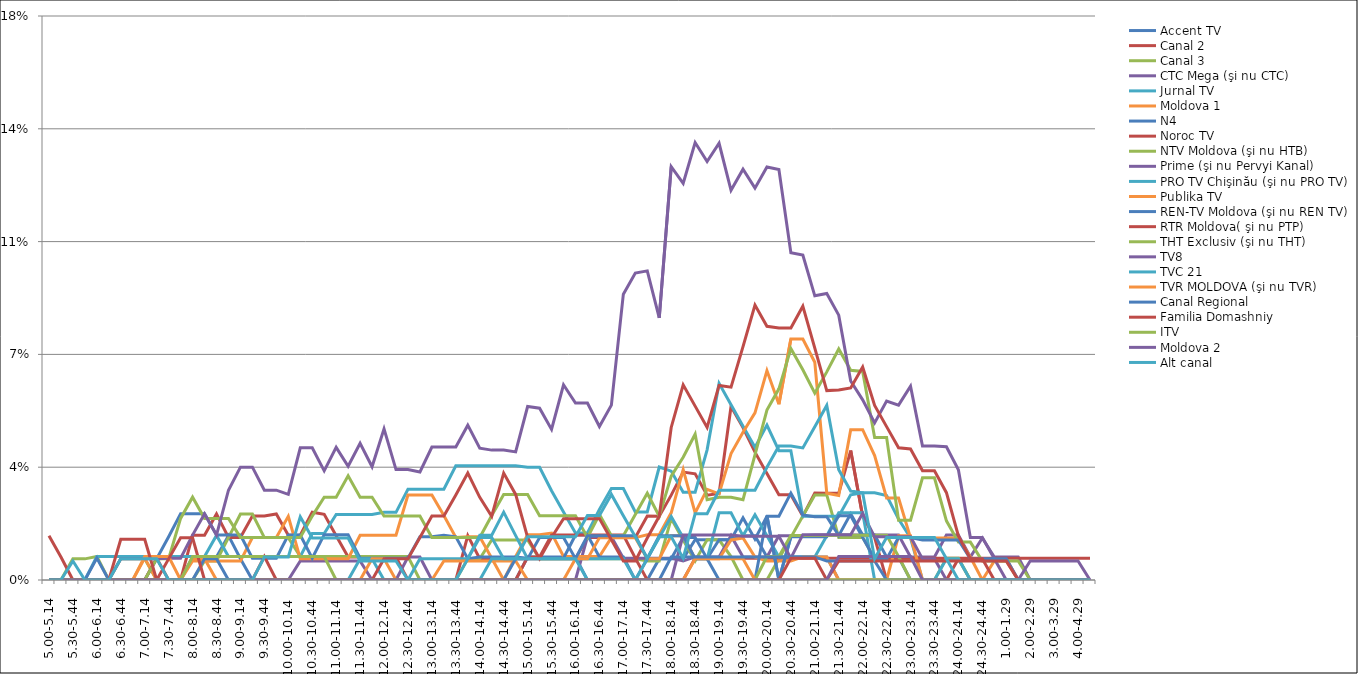
| Category | Accent TV | Canal 2 | Canal 3 | CTC Mega (şi nu CTC) | Jurnal TV | Moldova 1 | N4 | Noroc TV | NTV Moldova (şi nu HTB) | Prime (şi nu Pervyi Kanal) | PRO TV Chişinău (şi nu PRO TV) | Publika TV  | REN-TV Moldova (şi nu REN TV)  | RTR Moldova( şi nu PTP)  | THT Exclusiv (şi nu THT) | TV8 | TVC 21 | TVR MOLDOVA (şi nu TVR) | Canal Regional | Familia Domashniy | ITV | Moldova 2 | Alt canal |
|---|---|---|---|---|---|---|---|---|---|---|---|---|---|---|---|---|---|---|---|---|---|---|---|
| 5.00-5.14 | 0 | 0 | 0 | 0 | 0 | 0 | 0 | 0 | 0 | 0 | 0 | 0 | 0 | 0.014 | 0 | 0 | 0 | 0 | 0 | 0 | 0 | 0 | 0 |
| 5.15-5.29 | 0 | 0 | 0 | 0 | 0 | 0 | 0 | 0 | 0 | 0 | 0 | 0 | 0 | 0.007 | 0 | 0 | 0 | 0 | 0 | 0 | 0 | 0 | 0 |
| 5.30-5.44 | 0 | 0 | 0.007 | 0 | 0 | 0 | 0 | 0 | 0 | 0 | 0 | 0 | 0 | 0 | 0 | 0 | 0 | 0 | 0 | 0 | 0 | 0 | 0.006 |
| 5.45-5.59 | 0 | 0 | 0.007 | 0 | 0 | 0 | 0 | 0 | 0 | 0 | 0 | 0 | 0 | 0 | 0 | 0 | 0 | 0 | 0 | 0 | 0 | 0 | 0 |
| 6.00-6.14 | 0 | 0 | 0.007 | 0 | 0.007 | 0 | 0.007 | 0 | 0 | 0 | 0 | 0 | 0 | 0 | 0 | 0 | 0 | 0 | 0 | 0 | 0 | 0 | 0 |
| 6.15-6.29 | 0 | 0 | 0 | 0 | 0.007 | 0 | 0 | 0 | 0 | 0 | 0 | 0 | 0 | 0 | 0 | 0 | 0 | 0 | 0 | 0 | 0 | 0 | 0 |
| 6.30-6.44 | 0 | 0 | 0.007 | 0 | 0.007 | 0 | 0 | 0 | 0 | 0.007 | 0 | 0 | 0 | 0.013 | 0 | 0 | 0 | 0 | 0 | 0 | 0 | 0 | 0.007 |
| 6.45-6.59 | 0 | 0 | 0.007 | 0 | 0.007 | 0 | 0 | 0 | 0 | 0.007 | 0 | 0 | 0 | 0.013 | 0 | 0 | 0 | 0 | 0 | 0 | 0 | 0 | 0.007 |
| 7.00-7.14 | 0 | 0 | 0.007 | 0 | 0.007 | 0.007 | 0 | 0 | 0 | 0.007 | 0 | 0.007 | 0 | 0.013 | 0 | 0 | 0 | 0 | 0 | 0 | 0 | 0 | 0.007 |
| 7.15-7.29 | 0 | 0 | 0 | 0 | 0.007 | 0 | 0.007 | 0.007 | 0.007 | 0.007 | 0 | 0.007 | 0 | 0 | 0 | 0 | 0 | 0 | 0 | 0 | 0 | 0 | 0.007 |
| 7.30-7.44 | 0 | 0 | 0 | 0 | 0.007 | 0 | 0.013 | 0 | 0.007 | 0.007 | 0 | 0.007 | 0 | 0.007 | 0 | 0 | 0 | 0 | 0 | 0 | 0 | 0 | 0 |
| 7.45-7.59 | 0 | 0 | 0 | 0 | 0.007 | 0 | 0.021 | 0 | 0.019 | 0.007 | 0 | 0 | 0 | 0.013 | 0 | 0 | 0 | 0 | 0 | 0 | 0 | 0 | 0 |
| 8.00-8.14 | 0.007 | 0.014 | 0 | 0 | 0.007 | 0.006 | 0.021 | 0 | 0.026 | 0.014 | 0 | 0.007 | 0 | 0.013 | 0.007 | 0 | 0 | 0 | 0 | 0 | 0 | 0 | 0 |
| 8.15-8.29 | 0.007 | 0.014 | 0.006 | 0 | 0.007 | 0.006 | 0.021 | 0 | 0.019 | 0.021 | 0 | 0.007 | 0.007 | 0 | 0.007 | 0 | 0 | 0 | 0 | 0 | 0 | 0 | 0 |
| 8.30-8.44 | 0.007 | 0.021 | 0.006 | 0 | 0.014 | 0.006 | 0.014 | 0 | 0.019 | 0.014 | 0 | 0 | 0.007 | 0 | 0.007 | 0 | 0 | 0 | 0 | 0 | 0 | 0 | 0 |
| 8.45-8.59 | 0.014 | 0.013 | 0.013 | 0 | 0.007 | 0.006 | 0.014 | 0 | 0.019 | 0.028 | 0 | 0 | 0 | 0 | 0.007 | 0 | 0 | 0 | 0 | 0 | 0 | 0 | 0 |
| 9.00-9.14 | 0.007 | 0.013 | 0.02 | 0 | 0.007 | 0.006 | 0.014 | 0 | 0.013 | 0.035 | 0 | 0 | 0 | 0 | 0.007 | 0 | 0 | 0 | 0 | 0 | 0 | 0 | 0 |
| 9.15-9.29 | 0 | 0.02 | 0.02 | 0 | 0.007 | 0.013 | 0.007 | 0 | 0.013 | 0.035 | 0 | 0 | 0 | 0 | 0.007 | 0 | 0 | 0 | 0 | 0 | 0 | 0 | 0 |
| 9.30-9.44 | 0 | 0.02 | 0.013 | 0 | 0.007 | 0.013 | 0.007 | 0 | 0.013 | 0.028 | 0 | 0 | 0 | 0.007 | 0.007 | 0 | 0 | 0 | 0 | 0 | 0 | 0 | 0.007 |
| 9.45-9.59 | 0 | 0.021 | 0.013 | 0 | 0.007 | 0.013 | 0.007 | 0 | 0.013 | 0.028 | 0 | 0 | 0 | 0 | 0.007 | 0 | 0 | 0 | 0 | 0 | 0 | 0 | 0.007 |
| 10.00-10.14 | 0 | 0.014 | 0.013 | 0 | 0.007 | 0.02 | 0.014 | 0 | 0.013 | 0.027 | 0 | 0 | 0 | 0 | 0.007 | 0 | 0 | 0 | 0 | 0 | 0 | 0 | 0.007 |
| 10.15-10.29 | 0 | 0.014 | 0.007 | 0.006 | 0.007 | 0.007 | 0.014 | 0 | 0.013 | 0.041 | 0 | 0 | 0 | 0 | 0.007 | 0 | 0 | 0 | 0 | 0 | 0 | 0 | 0.02 |
| 10.30-10.44 | 0 | 0.021 | 0.007 | 0.006 | 0.014 | 0.007 | 0.007 | 0 | 0.02 | 0.041 | 0 | 0 | 0 | 0 | 0.007 | 0 | 0 | 0 | 0 | 0 | 0 | 0 | 0.013 |
| 10.45-10.59 | 0 | 0.02 | 0.007 | 0.006 | 0.014 | 0.007 | 0.014 | 0 | 0.026 | 0.034 | 0 | 0 | 0 | 0 | 0.007 | 0 | 0 | 0 | 0 | 0 | 0 | 0 | 0.013 |
| 11.00-11.14 | 0 | 0.014 | 0.007 | 0.006 | 0.02 | 0.007 | 0.014 | 0 | 0.026 | 0.041 | 0 | 0 | 0 | 0 | 0 | 0 | 0 | 0 | 0 | 0 | 0 | 0 | 0.013 |
| 11.15-11.29 | 0 | 0.007 | 0.007 | 0.006 | 0.02 | 0.007 | 0.014 | 0 | 0.032 | 0.035 | 0 | 0 | 0 | 0 | 0 | 0 | 0 | 0 | 0 | 0 | 0 | 0 | 0.013 |
| 11.30-11.44 | 0 | 0.007 | 0.007 | 0.006 | 0.02 | 0.014 | 0.007 | 0 | 0.026 | 0.042 | 0.007 | 0 | 0 | 0 | 0 | 0 | 0 | 0 | 0 | 0 | 0 | 0 | 0.006 |
| 11.45-11.59 | 0 | 0.007 | 0.007 | 0 | 0.02 | 0.014 | 0.007 | 0 | 0.026 | 0.035 | 0.007 | 0.007 | 0 | 0 | 0 | 0 | 0 | 0 | 0 | 0 | 0 | 0 | 0.006 |
| 12.00-12.14 | 0 | 0.007 | 0.007 | 0 | 0.021 | 0.014 | 0.007 | 0 | 0.02 | 0.047 | 0 | 0.007 | 0 | 0.007 | 0 | 0 | 0 | 0 | 0 | 0 | 0 | 0 | 0.006 |
| 12.15-12.29 | 0 | 0.007 | 0.007 | 0 | 0.021 | 0.014 | 0.007 | 0 | 0.02 | 0.034 | 0 | 0 | 0 | 0.007 | 0 | 0 | 0 | 0 | 0 | 0 | 0 | 0 | 0.006 |
| 12.30-12.44 | 0 | 0 | 0.007 | 0.007 | 0.028 | 0.026 | 0.007 | 0 | 0.02 | 0.034 | 0 | 0 | 0 | 0.007 | 0 | 0 | 0 | 0 | 0 | 0 | 0 | 0 | 0 |
| 12.45-12.59 | 0 | 0 | 0 | 0.007 | 0.028 | 0.026 | 0.013 | 0 | 0.02 | 0.034 | 0.007 | 0 | 0 | 0.013 | 0 | 0 | 0 | 0 | 0 | 0 | 0 | 0 | 0 |
| 13.00-13.14 | 0 | 0 | 0 | 0 | 0.028 | 0.026 | 0.013 | 0 | 0.013 | 0.041 | 0.007 | 0 | 0 | 0.02 | 0 | 0 | 0 | 0 | 0 | 0 | 0 | 0 | 0 |
| 13.15-13.29 | 0 | 0 | 0 | 0 | 0.028 | 0.02 | 0.014 | 0 | 0.013 | 0.041 | 0.007 | 0.006 | 0 | 0.02 | 0 | 0 | 0 | 0 | 0 | 0 | 0 | 0 | 0 |
| 13.30-13.44 | 0 | 0 | 0 | 0 | 0.035 | 0.013 | 0.013 | 0 | 0.013 | 0.041 | 0.007 | 0.006 | 0 | 0.026 | 0 | 0 | 0 | 0 | 0 | 0 | 0 | 0 | 0 |
| 13.45-13.59 | 0 | 0.014 | 0.007 | 0 | 0.035 | 0.013 | 0.007 | 0 | 0.013 | 0.048 | 0.007 | 0.006 | 0 | 0.033 | 0 | 0 | 0 | 0 | 0 | 0 | 0 | 0 | 0.007 |
| 14.00-14.14 | 0 | 0.007 | 0.007 | 0 | 0.035 | 0.013 | 0.007 | 0 | 0.013 | 0.041 | 0.014 | 0.006 | 0 | 0.026 | 0 | 0 | 0 | 0 | 0 | 0 | 0 | 0 | 0.013 |
| 14.15-14.29 | 0 | 0.007 | 0.012 | 0 | 0.035 | 0.007 | 0.007 | 0 | 0.02 | 0.04 | 0.014 | 0.006 | 0 | 0.02 | 0 | 0 | 0.007 | 0 | 0 | 0 | 0 | 0 | 0.013 |
| 14.30-14.44 | 0 | 0.007 | 0.012 | 0 | 0.035 | 0 | 0.007 | 0 | 0.027 | 0.04 | 0.021 | 0.006 | 0 | 0.033 | 0 | 0 | 0.007 | 0 | 0 | 0 | 0 | 0 | 0.007 |
| 14.45-14.59 | 0 | 0.007 | 0.012 | 0 | 0.035 | 0.007 | 0.007 | 0 | 0.027 | 0.04 | 0.014 | 0.006 | 0.007 | 0.027 | 0 | 0 | 0.007 | 0 | 0 | 0 | 0 | 0 | 0.007 |
| 15.00-15.14 | 0.007 | 0.007 | 0.012 | 0 | 0.035 | 0.014 | 0.007 | 0.007 | 0.027 | 0.054 | 0.007 | 0 | 0.007 | 0.013 | 0 | 0 | 0.007 | 0 | 0 | 0 | 0 | 0 | 0.013 |
| 15.15-15.29 | 0.007 | 0.007 | 0.007 | 0 | 0.035 | 0.014 | 0.007 | 0.007 | 0.02 | 0.053 | 0.007 | 0 | 0.013 | 0.007 | 0 | 0 | 0.007 | 0 | 0 | 0 | 0 | 0 | 0.013 |
| 15.30-15.44 | 0.007 | 0.007 | 0.007 | 0 | 0.028 | 0.015 | 0.007 | 0.014 | 0.02 | 0.047 | 0.007 | 0 | 0.013 | 0.013 | 0 | 0 | 0.007 | 0 | 0 | 0 | 0 | 0 | 0.013 |
| 15.45-15.59 | 0.007 | 0.007 | 0.007 | 0 | 0.021 | 0.007 | 0.007 | 0.014 | 0.02 | 0.061 | 0.007 | 0 | 0.013 | 0.019 | 0 | 0 | 0.007 | 0 | 0 | 0 | 0 | 0 | 0.013 |
| 16.00-16.14 | 0.007 | 0.007 | 0.007 | 0 | 0.015 | 0.007 | 0.014 | 0.014 | 0.02 | 0.055 | 0.007 | 0.007 | 0.007 | 0.019 | 0 | 0 | 0.007 | 0 | 0 | 0 | 0 | 0 | 0.013 |
| 16.15-16.29 | 0 | 0.013 | 0.007 | 0.013 | 0.015 | 0.007 | 0.014 | 0.014 | 0.013 | 0.055 | 0.007 | 0.007 | 0.014 | 0.019 | 0 | 0 | 0 | 0 | 0 | 0 | 0 | 0 | 0.02 |
| 16.30-16.44 | 0 | 0.013 | 0.007 | 0.013 | 0.022 | 0.007 | 0.007 | 0.014 | 0.02 | 0.048 | 0.007 | 0.013 | 0.014 | 0.019 | 0 | 0 | 0 | 0 | 0 | 0 | 0 | 0 | 0.02 |
| 16.45-16.59 | 0 | 0.013 | 0.007 | 0.013 | 0.028 | 0.013 | 0.007 | 0.014 | 0.014 | 0.054 | 0.007 | 0.013 | 0.014 | 0.012 | 0 | 0 | 0 | 0 | 0 | 0 | 0 | 0 | 0.027 |
| 17.00-17.14 | 0 | 0.013 | 0.007 | 0.007 | 0.028 | 0.013 | 0.007 | 0.014 | 0.014 | 0.089 | 0.007 | 0.013 | 0.014 | 0.006 | 0 | 0 | 0 | 0 | 0 | 0 | 0 | 0 | 0.02 |
| 17.15-17.29 | 0 | 0.013 | 0.007 | 0.007 | 0.021 | 0.013 | 0 | 0.007 | 0.02 | 0.095 | 0 | 0.013 | 0.014 | 0.006 | 0 | 0 | 0 | 0 | 0 | 0 | 0 | 0 | 0.013 |
| 17.30-17.44 | 0 | 0.02 | 0.006 | 0.007 | 0.021 | 0.014 | 0.007 | 0 | 0.027 | 0.096 | 0.007 | 0.007 | 0.007 | 0.013 | 0 | 0 | 0 | 0 | 0 | 0 | 0 | 0 | 0.007 |
| 17.45-17.59 | 0.007 | 0.02 | 0.006 | 0.007 | 0.035 | 0.014 | 0.007 | 0 | 0.02 | 0.081 | 0.013 | 0.007 | 0.014 | 0.02 | 0 | 0 | 0 | 0 | 0 | 0 | 0 | 0 | 0.013 |
| 18.00-18.14 | 0.007 | 0.026 | 0.019 | 0.007 | 0.034 | 0.021 | 0.007 | 0 | 0.032 | 0.128 | 0.02 | 0.014 | 0.014 | 0.047 | 0 | 0 | 0 | 0 | 0.007 | 0 | 0 | 0 | 0.013 |
| 18.15-18.29 | 0.007 | 0.033 | 0.012 | 0.006 | 0.027 | 0.034 | 0.013 | 0 | 0.038 | 0.123 | 0.013 | 0.014 | 0.014 | 0.061 | 0 | 0.014 | 0 | 0 | 0.007 | 0 | 0 | 0 | 0.007 |
| 18.30-18.44 | 0.012 | 0.033 | 0.006 | 0.007 | 0.027 | 0.021 | 0.013 | 0.007 | 0.045 | 0.136 | 0.007 | 0.007 | 0.007 | 0.054 | 0 | 0.014 | 0 | 0.007 | 0.007 | 0 | 0 | 0 | 0.021 |
| 18.45-18.59 | 0.012 | 0.026 | 0.012 | 0.007 | 0.04 | 0.028 | 0.007 | 0.007 | 0.025 | 0.13 | 0.007 | 0.007 | 0.007 | 0.047 | 0 | 0.014 | 0 | 0.007 | 0.007 | 0 | 0 | 0 | 0.021 |
| 19.00-19.14 | 0.012 | 0.027 | 0.012 | 0.007 | 0.061 | 0.027 | 0.012 | 0.007 | 0.026 | 0.136 | 0.021 | 0.007 | 0 | 0.06 | 0 | 0.014 | 0 | 0.007 | 0.007 | 0 | 0 | 0 | 0.028 |
| 19.15-19.29 | 0.012 | 0.054 | 0.007 | 0.014 | 0.054 | 0.039 | 0.012 | 0.007 | 0.026 | 0.121 | 0.021 | 0.012 | 0 | 0.06 | 0 | 0.014 | 0 | 0.007 | 0.007 | 0 | 0 | 0 | 0.028 |
| 19.30-19.44 | 0.014 | 0.047 | 0 | 0.007 | 0.048 | 0.046 | 0.019 | 0.007 | 0.025 | 0.127 | 0.014 | 0.013 | 0 | 0.072 | 0 | 0.014 | 0 | 0.007 | 0.007 | 0 | 0 | 0 | 0.028 |
| 19.45-19.59 | 0.014 | 0.04 | 0 | 0.007 | 0.041 | 0.052 | 0.013 | 0.007 | 0.039 | 0.122 | 0.02 | 0.007 | 0 | 0.085 | 0 | 0.014 | 0 | 0 | 0.007 | 0 | 0 | 0 | 0.028 |
| 20.00-20.14 | 0.007 | 0.033 | 0 | 0.007 | 0.048 | 0.065 | 0.02 | 0.007 | 0.053 | 0.128 | 0.014 | 0.006 | 0.02 | 0.079 | 0.007 | 0.014 | 0 | 0 | 0.007 | 0 | 0 | 0 | 0.035 |
| 20.15-20.29 | 0.007 | 0.026 | 0.007 | 0.014 | 0.04 | 0.055 | 0.02 | 0.007 | 0.059 | 0.127 | 0.007 | 0.006 | 0 | 0.078 | 0.007 | 0.014 | 0 | 0 | 0.007 | 0 | 0 | 0 | 0.042 |
| 20.30-20.44 | 0.007 | 0.026 | 0.013 | 0.014 | 0.04 | 0.075 | 0.027 | 0.007 | 0.072 | 0.102 | 0.007 | 0.006 | 0.013 | 0.078 | 0.014 | 0.007 | 0 | 0 | 0.007 | 0.007 | 0 | 0 | 0.042 |
| 20.45-20.59 | 0.007 | 0.02 | 0.02 | 0.014 | 0.02 | 0.075 | 0.02 | 0.007 | 0.065 | 0.101 | 0.007 | 0.007 | 0.013 | 0.085 | 0.014 | 0.014 | 0 | 0 | 0.007 | 0.007 | 0 | 0 | 0.041 |
| 21.00-21.14 | 0.007 | 0.027 | 0.026 | 0.014 | 0.02 | 0.068 | 0.02 | 0.007 | 0.058 | 0.088 | 0.007 | 0.007 | 0.013 | 0.072 | 0.014 | 0.014 | 0 | 0 | 0.007 | 0.007 | 0 | 0 | 0.048 |
| 21.15-21.29 | 0.007 | 0.027 | 0.026 | 0.014 | 0.02 | 0.027 | 0.02 | 0.007 | 0.065 | 0.089 | 0.014 | 0.007 | 0.013 | 0.059 | 0.014 | 0.014 | 0 | 0 | 0.006 | 0 | 0 | 0 | 0.054 |
| 21.30-21.44 | 0 | 0.027 | 0.013 | 0.014 | 0.02 | 0.026 | 0.014 | 0.007 | 0.072 | 0.082 | 0.021 | 0 | 0.02 | 0.059 | 0.014 | 0.014 | 0 | 0 | 0.006 | 0.006 | 0 | 0.007 | 0.034 |
| 21.45-21.59 | 0 | 0.04 | 0.013 | 0.014 | 0.026 | 0.047 | 0.021 | 0.007 | 0.065 | 0.062 | 0.021 | 0 | 0.02 | 0.06 | 0.014 | 0.014 | 0 | 0 | 0.006 | 0.006 | 0 | 0.007 | 0.028 |
| 22.00-22.14 | 0 | 0.02 | 0.013 | 0.014 | 0.027 | 0.047 | 0.014 | 0.007 | 0.065 | 0.056 | 0.021 | 0 | 0.013 | 0.066 | 0.014 | 0.021 | 0 | 0 | 0.006 | 0.006 | 0 | 0.007 | 0.027 |
| 22.15-22.29 | 0 | 0.013 | 0.007 | 0.014 | 0.027 | 0.039 | 0.014 | 0.007 | 0.044 | 0.049 | 0 | 0 | 0.007 | 0.054 | 0.014 | 0.013 | 0 | 0 | 0.006 | 0.006 | 0 | 0.007 | 0.007 |
| 22.30-22.44 | 0 | 0 | 0.007 | 0.014 | 0.026 | 0.025 | 0.007 | 0.007 | 0.044 | 0.056 | 0 | 0 | 0.007 | 0.048 | 0.014 | 0.013 | 0 | 0 | 0 | 0.006 | 0 | 0.007 | 0.013 |
| 22.45-22.59 | 0 | 0 | 0.007 | 0.014 | 0.019 | 0.025 | 0.007 | 0.007 | 0.019 | 0.054 | 0 | 0.014 | 0.013 | 0.041 | 0.007 | 0.013 | 0 | 0 | 0 | 0.006 | 0 | 0.007 | 0.013 |
| 23.00-23.14 | 0 | 0 | 0.007 | 0.007 | 0.013 | 0.013 | 0 | 0.007 | 0.019 | 0.06 | 0 | 0.014 | 0.013 | 0.041 | 0 | 0.013 | 0 | 0 | 0 | 0.006 | 0 | 0.007 | 0.013 |
| 23.15-23.29 | 0 | 0 | 0.007 | 0.007 | 0 | 0.013 | 0 | 0.007 | 0.032 | 0.042 | 0 | 0 | 0.012 | 0.034 | 0 | 0.007 | 0 | 0 | 0 | 0.006 | 0 | 0 | 0.013 |
| 23.30-23.44 | 0 | 0 | 0.007 | 0.007 | 0 | 0.013 | 0 | 0.007 | 0.032 | 0.042 | 0 | 0 | 0.012 | 0.034 | 0 | 0.007 | 0 | 0 | 0 | 0.006 | 0 | 0 | 0.013 |
| 23.45-23.59 | 0 | 0 | 0.007 | 0.014 | 0 | 0.013 | 0 | 0.007 | 0.018 | 0.041 | 0 | 0 | 0.012 | 0.027 | 0.007 | 0 | 0.007 | 0 | 0 | 0.006 | 0 | 0 | 0.007 |
| 24.00-24.14 | 0 | 0.007 | 0.007 | 0.014 | 0 | 0.013 | 0 | 0.007 | 0.012 | 0.034 | 0 | 0 | 0.012 | 0.014 | 0.007 | 0 | 0.007 | 0 | 0 | 0.006 | 0 | 0 | 0 |
| 24.15-24.29 | 0 | 0.007 | 0 | 0.007 | 0 | 0.007 | 0 | 0.007 | 0.012 | 0.013 | 0 | 0 | 0.007 | 0.007 | 0 | 0 | 0 | 0 | 0 | 0.006 | 0 | 0 | 0 |
| 24.30-24.44 | 0 | 0.007 | 0 | 0.013 | 0 | 0 | 0 | 0.007 | 0.006 | 0.013 | 0 | 0 | 0.007 | 0.007 | 0 | 0 | 0 | 0 | 0 | 0.006 | 0 | 0 | 0 |
| 24.45-24.59 | 0 | 0.007 | 0 | 0.007 | 0 | 0.006 | 0 | 0.007 | 0.006 | 0.007 | 0 | 0 | 0.007 | 0 | 0 | 0 | 0 | 0 | 0 | 0.006 | 0 | 0 | 0 |
| 1.00-1.29 | 0 | 0.007 | 0 | 0.007 | 0 | 0.006 | 0 | 0.007 | 0.006 | 0 | 0 | 0 | 0.007 | 0 | 0 | 0 | 0 | 0 | 0 | 0.006 | 0 | 0 | 0 |
| 1.30-1. 59 | 0 | 0 | 0 | 0.007 | 0 | 0 | 0 | 0.007 | 0.006 | 0 | 0 | 0 | 0 | 0 | 0 | 0 | 0 | 0 | 0 | 0 | 0 | 0 | 0 |
| 2.00-2.29 | 0 | 0 | 0 | 0 | 0 | 0 | 0 | 0.007 | 0 | 0.006 | 0 | 0 | 0 | 0 | 0 | 0 | 0 | 0 | 0 | 0 | 0 | 0 | 0 |
| 2.30-2.59 | 0 | 0 | 0 | 0 | 0 | 0 | 0 | 0.007 | 0 | 0.006 | 0 | 0 | 0 | 0 | 0 | 0 | 0 | 0 | 0 | 0 | 0 | 0 | 0 |
| 3.00-3.29 | 0 | 0 | 0 | 0 | 0 | 0 | 0 | 0.007 | 0 | 0.006 | 0 | 0 | 0 | 0 | 0 | 0 | 0 | 0 | 0 | 0 | 0 | 0 | 0 |
| 3.30-3.59 | 0 | 0 | 0 | 0 | 0 | 0 | 0 | 0.007 | 0 | 0.006 | 0 | 0 | 0 | 0 | 0 | 0 | 0 | 0 | 0 | 0 | 0 | 0 | 0 |
| 4.00-4.29 | 0 | 0 | 0 | 0 | 0 | 0 | 0 | 0.007 | 0 | 0.006 | 0 | 0 | 0 | 0 | 0 | 0 | 0 | 0 | 0 | 0 | 0 | 0 | 0 |
| 4.30-4.59 | 0 | 0 | 0 | 0 | 0 | 0 | 0 | 0.007 | 0 | 0 | 0 | 0 | 0 | 0 | 0 | 0 | 0 | 0 | 0 | 0 | 0 | 0 | 0 |